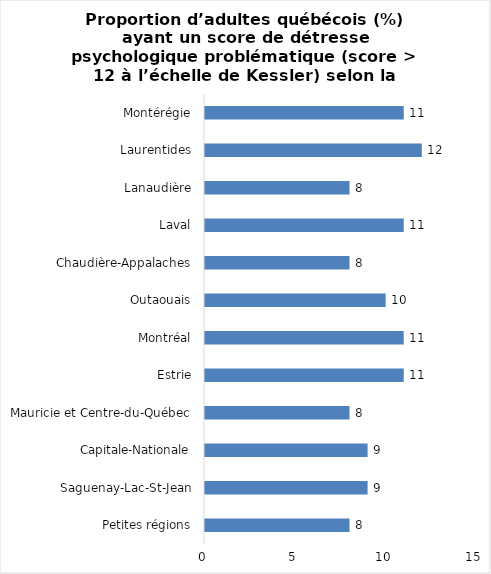
| Category | Series 0 |
|---|---|
| Petites régions | 8 |
| Saguenay-Lac-St-Jean | 9 |
| Capitale-Nationale | 9 |
| Mauricie et Centre-du-Québec | 8 |
| Estrie | 11 |
| Montréal | 11 |
| Outaouais | 10 |
| Chaudière-Appalaches | 8 |
| Laval | 11 |
| Lanaudière | 8 |
| Laurentides | 12 |
| Montérégie | 11 |